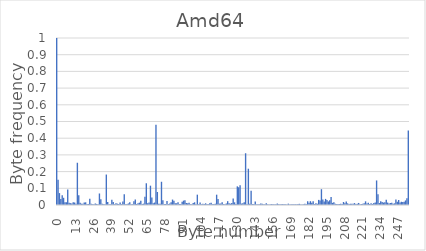
| Category | Series 0 |
|---|---|
| 0.0 | 1 |
| 1.0 | 0.151 |
| 2.0 | 0.071 |
| 3.0 | 0.037 |
| 4.0 | 0.058 |
| 5.0 | 0.043 |
| 6.0 | 0.016 |
| 7.0 | 0.017 |
| 8.0 | 0.093 |
| 9.0 | 0.013 |
| 10.0 | 0.011 |
| 11.0 | 0.009 |
| 12.0 | 0.017 |
| 13.0 | 0.015 |
| 14.0 | 0.007 |
| 15.0 | 0.253 |
| 16.0 | 0.059 |
| 17.0 | 0.014 |
| 18.0 | 0.008 |
| 19.0 | 0.007 |
| 20.0 | 0.014 |
| 21.0 | 0.016 |
| 22.0 | 0.006 |
| 23.0 | 0.006 |
| 24.0 | 0.038 |
| 25.0 | 0.008 |
| 26.0 | 0.005 |
| 27.0 | 0.005 |
| 28.0 | 0.009 |
| 29.0 | 0.006 |
| 30.0 | 0.005 |
| 31.0 | 0.069 |
| 32.0 | 0.034 |
| 33.0 | 0.008 |
| 34.0 | 0.004 |
| 35.0 | 0.005 |
| 36.0 | 0.182 |
| 37.0 | 0.017 |
| 38.0 | 0.004 |
| 39.0 | 0.004 |
| 40.0 | 0.032 |
| 41.0 | 0.017 |
| 42.0 | 0.005 |
| 43.0 | 0.01 |
| 44.0 | 0.008 |
| 45.0 | 0.007 |
| 46.0 | 0.015 |
| 47.0 | 0.005 |
| 48.0 | 0.021 |
| 49.0 | 0.065 |
| 50.0 | 0.004 |
| 51.0 | 0.006 |
| 52.0 | 0.009 |
| 53.0 | 0.016 |
| 54.0 | 0.005 |
| 55.0 | 0.005 |
| 56.0 | 0.023 |
| 57.0 | 0.033 |
| 58.0 | 0.006 |
| 59.0 | 0.011 |
| 60.0 | 0.014 |
| 61.0 | 0.026 |
| 62.0 | 0.006 |
| 63.0 | 0.008 |
| 64.0 | 0.05 |
| 65.0 | 0.13 |
| 66.0 | 0.011 |
| 67.0 | 0.016 |
| 68.0 | 0.116 |
| 69.0 | 0.046 |
| 70.0 | 0.011 |
| 71.0 | 0.015 |
| 72.0 | 0.48 |
| 73.0 | 0.078 |
| 74.0 | 0.008 |
| 75.0 | 0.007 |
| 76.0 | 0.139 |
| 77.0 | 0.029 |
| 78.0 | 0.006 |
| 79.0 | 0.006 |
| 80.0 | 0.024 |
| 81.0 | 0.006 |
| 82.0 | 0.008 |
| 83.0 | 0.017 |
| 84.0 | 0.033 |
| 85.0 | 0.025 |
| 86.0 | 0.011 |
| 87.0 | 0.01 |
| 88.0 | 0.017 |
| 89.0 | 0.006 |
| 90.0 | 0.005 |
| 91.0 | 0.019 |
| 92.0 | 0.026 |
| 93.0 | 0.029 |
| 94.0 | 0.011 |
| 95.0 | 0.01 |
| 96.0 | 0.014 |
| 97.0 | 0.005 |
| 98.0 | 0.005 |
| 99.0 | 0.012 |
| 100.0 | 0.016 |
| 101.0 | 0.005 |
| 102.0 | 0.062 |
| 103.0 | 0.005 |
| 104.0 | 0.015 |
| 105.0 | 0.004 |
| 106.0 | 0.007 |
| 107.0 | 0.006 |
| 108.0 | 0.01 |
| 109.0 | 0.006 |
| 110.0 | 0.005 |
| 111.0 | 0.011 |
| 112.0 | 0.014 |
| 113.0 | 0.005 |
| 114.0 | 0.006 |
| 115.0 | 0.008 |
| 116.0 | 0.062 |
| 117.0 | 0.035 |
| 118.0 | 0.008 |
| 119.0 | 0.01 |
| 120.0 | 0.016 |
| 121.0 | 0.005 |
| 122.0 | 0.005 |
| 123.0 | 0.009 |
| 124.0 | 0.023 |
| 125.0 | 0.011 |
| 126.0 | 0.008 |
| 127.0 | 0.012 |
| 128.0 | 0.04 |
| 129.0 | 0.016 |
| 130.0 | 0.006 |
| 131.0 | 0.112 |
| 132.0 | 0.106 |
| 133.0 | 0.118 |
| 134.0 | 0.009 |
| 135.0 | 0.011 |
| 136.0 | 0.016 |
| 137.0 | 0.31 |
| 138.0 | 0.004 |
| 139.0 | 0.217 |
| 140.0 | 0.007 |
| 141.0 | 0.085 |
| 142.0 | 0.006 |
| 143.0 | 0.005 |
| 144.0 | 0.021 |
| 145.0 | 0.003 |
| 146.0 | 0.004 |
| 147.0 | 0.004 |
| 148.0 | 0.01 |
| 149.0 | 0.007 |
| 150.0 | 0.004 |
| 151.0 | 0.005 |
| 152.0 | 0.01 |
| 153.0 | 0.004 |
| 154.0 | 0.003 |
| 155.0 | 0.004 |
| 156.0 | 0.006 |
| 157.0 | 0.004 |
| 158.0 | 0.003 |
| 159.0 | 0.004 |
| 160.0 | 0.009 |
| 161.0 | 0.004 |
| 162.0 | 0.004 |
| 163.0 | 0.004 |
| 164.0 | 0.006 |
| 165.0 | 0.004 |
| 166.0 | 0.004 |
| 167.0 | 0.003 |
| 168.0 | 0.008 |
| 169.0 | 0.004 |
| 170.0 | 0.004 |
| 171.0 | 0.004 |
| 172.0 | 0.005 |
| 173.0 | 0.004 |
| 174.0 | 0.003 |
| 175.0 | 0.006 |
| 176.0 | 0.007 |
| 177.0 | 0.003 |
| 178.0 | 0.003 |
| 179.0 | 0.004 |
| 180.0 | 0.007 |
| 181.0 | 0.005 |
| 182.0 | 0.023 |
| 183.0 | 0.014 |
| 184.0 | 0.023 |
| 185.0 | 0.014 |
| 186.0 | 0.022 |
| 187.0 | 0.006 |
| 188.0 | 0.01 |
| 189.0 | 0.008 |
| 190.0 | 0.031 |
| 191.0 | 0.026 |
| 192.0 | 0.095 |
| 193.0 | 0.033 |
| 194.0 | 0.021 |
| 195.0 | 0.037 |
| 196.0 | 0.03 |
| 197.0 | 0.021 |
| 198.0 | 0.029 |
| 199.0 | 0.047 |
| 200.0 | 0.013 |
| 201.0 | 0.017 |
| 202.0 | 0.008 |
| 203.0 | 0.005 |
| 204.0 | 0.005 |
| 205.0 | 0.006 |
| 206.0 | 0.007 |
| 207.0 | 0.006 |
| 208.0 | 0.018 |
| 209.0 | 0.011 |
| 210.0 | 0.021 |
| 211.0 | 0.01 |
| 212.0 | 0.007 |
| 213.0 | 0.008 |
| 214.0 | 0.007 |
| 215.0 | 0.007 |
| 216.0 | 0.012 |
| 217.0 | 0.006 |
| 218.0 | 0.007 |
| 219.0 | 0.012 |
| 220.0 | 0.005 |
| 221.0 | 0.006 |
| 222.0 | 0.008 |
| 223.0 | 0.01 |
| 224.0 | 0.022 |
| 225.0 | 0.009 |
| 226.0 | 0.013 |
| 227.0 | 0.006 |
| 228.0 | 0.011 |
| 229.0 | 0.006 |
| 230.0 | 0.011 |
| 231.0 | 0.015 |
| 232.0 | 0.147 |
| 233.0 | 0.064 |
| 234.0 | 0.012 |
| 235.0 | 0.022 |
| 236.0 | 0.018 |
| 237.0 | 0.014 |
| 238.0 | 0.016 |
| 239.0 | 0.031 |
| 240.0 | 0.015 |
| 241.0 | 0.009 |
| 242.0 | 0.012 |
| 243.0 | 0.013 |
| 244.0 | 0.008 |
| 245.0 | 0.01 |
| 246.0 | 0.032 |
| 247.0 | 0.019 |
| 248.0 | 0.03 |
| 249.0 | 0.015 |
| 250.0 | 0.019 |
| 251.0 | 0.017 |
| 252.0 | 0.019 |
| 253.0 | 0.027 |
| 254.0 | 0.041 |
| 255.0 | 0.446 |